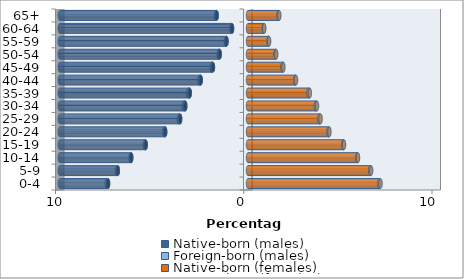
| Category | Native-born (males) | Foreign-born (males) | Native-born (females) | Foreign-born (females) |
|---|---|---|---|---|
| 0-4 | -7.435 | -0.069 | 6.98 | 0.061 |
| 5-9 | -6.915 | -0.051 | 6.499 | 0.043 |
| 10-14 | -6.202 | -0.04 | 5.814 | 0.029 |
| 15-19 | -5.435 | -0.044 | 5.067 | 0.034 |
| 20-24 | -4.399 | -0.056 | 4.279 | 0.046 |
| 25-29 | -3.605 | -0.07 | 3.801 | 0.057 |
| 30-34 | -3.333 | -0.081 | 3.607 | 0.061 |
| 35-39 | -3.094 | -0.083 | 3.228 | 0.057 |
| 40-44 | -2.51 | -0.078 | 2.507 | 0.048 |
| 45-49 | -1.863 | -0.066 | 1.84 | 0.04 |
| 50-54 | -1.504 | -0.052 | 1.467 | 0.032 |
| 55-59 | -1.141 | -0.043 | 1.093 | 0.028 |
| 60-64 | -0.848 | -0.036 | 0.84 | 0.024 |
| 65+ | -1.665 | -0.036 | 1.626 | 0.036 |